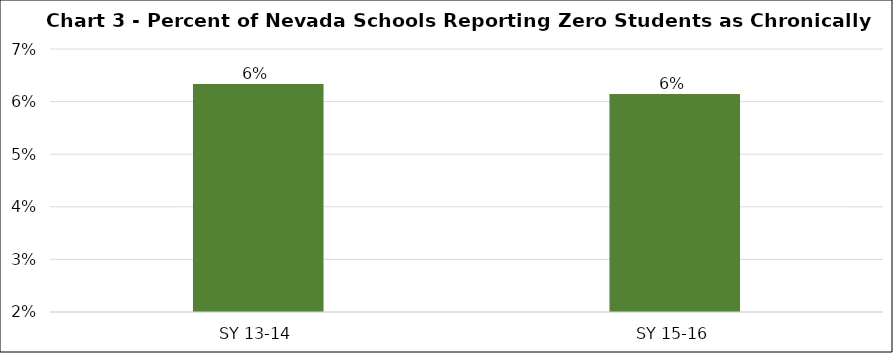
| Category | Series 0 |
|---|---|
| SY 13-14 | 0.063 |
| SY 15-16 | 0.061 |